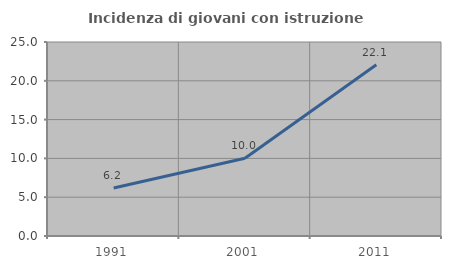
| Category | Incidenza di giovani con istruzione universitaria |
|---|---|
| 1991.0 | 6.195 |
| 2001.0 | 10.021 |
| 2011.0 | 22.078 |